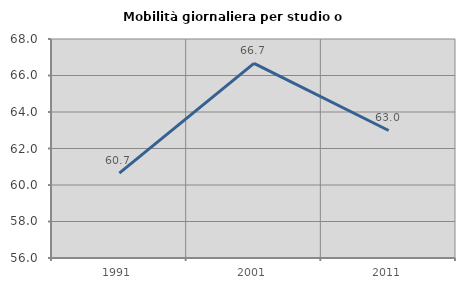
| Category | Mobilità giornaliera per studio o lavoro |
|---|---|
| 1991.0 | 60.653 |
| 2001.0 | 66.667 |
| 2011.0 | 62.986 |